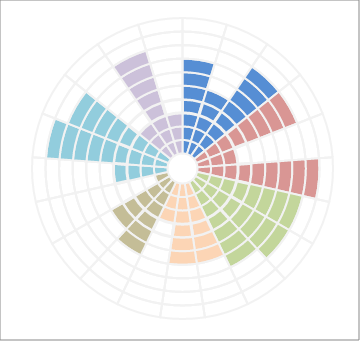
| Category | Series 0 | Series 1 | Series 2 | Series 3 | Series 4 | Series 5 | Series 6 | Series 7 | Series 8 | Series 9 |
|---|---|---|---|---|---|---|---|---|---|---|
| 0 | 10 | 10 | 10 | 10 | 10 | 10 | 10 | 0 | 0 | 0 |
| 1 | 0 | 0 | 0 | 0 | 0 | 0 | 0 | 10 | 10 | 10 |
| 2 | 10 | 10 | 10 | 10 | 10 | 0 | 0 | 0 | 0 | 0 |
| 3 | 0 | 0 | 0 | 0 | 0 | 10 | 10 | 10 | 10 | 10 |
| 4 | 10 | 10 | 10 | 10 | 10 | 10 | 10 | 10 | 0 | 0 |
| 5 | 0 | 0 | 0 | 0 | 0 | 0 | 0 | 0 | 10 | 10 |
| 6 | 10 | 10 | 10 | 10 | 10 | 10 | 10 | 10 | 0 | 0 |
| 7 | 0 | 0 | 0 | 0 | 0 | 0 | 0 | 0 | 10 | 10 |
| 8 | 10 | 10 | 10 | 0 | 0 | 0 | 0 | 0 | 0 | 0 |
| 9 | 0 | 0 | 0 | 10 | 10 | 10 | 10 | 10 | 10 | 10 |
| 10 | 10 | 10 | 10 | 10 | 10 | 10 | 10 | 10 | 10 | 0 |
| 11 | 0 | 0 | 0 | 0 | 0 | 0 | 0 | 0 | 0 | 10 |
| 12 | 10 | 10 | 10 | 10 | 10 | 10 | 10 | 10 | 0 | 0 |
| 13 | 0 | 0 | 0 | 0 | 0 | 0 | 0 | 0 | 10 | 10 |
| 14 | 10 | 10 | 10 | 10 | 10 | 10 | 10 | 10 | 0 | 0 |
| 15 | 0 | 0 | 0 | 0 | 0 | 0 | 0 | 0 | 10 | 10 |
| 16 | 10 | 10 | 10 | 10 | 10 | 10 | 10 | 0 | 0 | 0 |
| 17 | 0 | 0 | 0 | 0 | 0 | 0 | 0 | 10 | 10 | 10 |
| 18 | 10 | 10 | 10 | 10 | 10 | 10 | 0 | 0 | 0 | 0 |
| 19 | 0 | 0 | 0 | 0 | 0 | 0 | 10 | 10 | 10 | 10 |
| 20 | 10 | 10 | 10 | 10 | 10 | 10 | 0 | 0 | 0 | 0 |
| 21 | 0 | 0 | 0 | 0 | 0 | 0 | 10 | 10 | 10 | 10 |
| 22 | 10 | 10 | 10 | 0 | 0 | 0 | 0 | 0 | 0 | 0 |
| 23 | 0 | 0 | 0 | 10 | 10 | 10 | 10 | 10 | 10 | 10 |
| 24 | 10 | 10 | 10 | 10 | 10 | 10 | 0 | 0 | 0 | 0 |
| 25 | 0 | 0 | 0 | 0 | 0 | 0 | 10 | 10 | 10 | 10 |
| 26 | 10 | 10 | 10 | 10 | 10 | 0 | 0 | 0 | 0 | 0 |
| 27 | 0 | 0 | 0 | 0 | 0 | 10 | 10 | 10 | 10 | 10 |
| 28 | 10 | 0 | 0 | 0 | 0 | 0 | 0 | 0 | 0 | 0 |
| 29 | 0 | 10 | 10 | 10 | 10 | 10 | 10 | 10 | 10 | 10 |
| 30 | 10 | 10 | 10 | 10 | 0 | 0 | 0 | 0 | 0 | 0 |
| 31 | 0 | 0 | 0 | 0 | 10 | 10 | 10 | 10 | 10 | 10 |
| 32 | 10 | 10 | 10 | 10 | 10 | 10 | 10 | 10 | 10 | 0 |
| 33 | 0 | 0 | 0 | 0 | 0 | 0 | 0 | 0 | 0 | 10 |
| 34 | 10 | 10 | 10 | 10 | 10 | 10 | 10 | 10 | 0 | 0 |
| 35 | 0 | 0 | 0 | 0 | 0 | 0 | 0 | 0 | 10 | 10 |
| 36 | 10 | 10 | 10 | 0 | 0 | 0 | 0 | 0 | 0 | 0 |
| 37 | 0 | 0 | 0 | 10 | 10 | 10 | 10 | 10 | 10 | 10 |
| 38 | 10 | 10 | 10 | 10 | 10 | 10 | 10 | 10 | 0 | 0 |
| 39 | 0 | 0 | 0 | 0 | 0 | 0 | 0 | 0 | 10 | 10 |
| 40 | 10 | 10 | 10 | 0 | 0 | 0 | 0 | 0 | 0 | 0 |
| 41 | 0 | 0 | 0 | 10 | 10 | 10 | 10 | 10 | 10 | 10 |